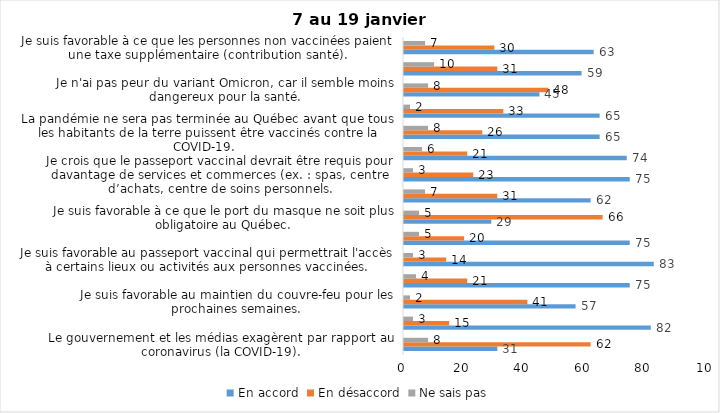
| Category | En accord | En désaccord | Ne sais pas |
|---|---|---|---|
| Le gouvernement et les médias exagèrent par rapport au coronavirus (la COVID-19). | 31 | 62 | 8 |
| J’ai peur que le système de santé soit débordé par les cas de COVID-19. | 82 | 15 | 3 |
| Je suis favorable au maintien du couvre-feu pour les prochaines semaines. | 57 | 41 | 2 |
| Je suis inquiet/inquiète que le nombre de cas augmente en raison des nouveaux variants du virus de la COVID-19. | 75 | 21 | 4 |
| Je suis favorable au passeport vaccinal qui permettrait l'accès à certains lieux ou activités aux personnes vaccinées. | 83 | 14 | 3 |
| Je suis confiant que la vaccination protège efficacement contre les variants de la COVID-19 | 75 | 20 | 5 |
| Je suis favorable à ce que le port du masque ne soit plus obligatoire au Québec. | 29 | 66 | 5 |
| J'ai peur que la reprise des cours en présentiel dans les écoles primaires et secondaires génère une augmentation des cas de COVID-19 | 62 | 31 | 7 |
| Je crois que le passeport vaccinal devrait être requis pour davantage de services et commerces (ex. : spas, centre d’achats, centre de soins personnels. | 75 | 23 | 3 |
| Les personnes non adéquatement vaccinées contre la COVID-19 sont responsables des nouveaux cas et hospitalisations et contribuent à la prolongation de la pandémie au Québec. | 74 | 21 | 6 |
| La pandémie ne sera pas terminée au Québec avant que tous les habitants de la terre puissent être vaccinés contre la COVID-19.   | 65 | 26 | 8 |
| Je suis inconfortable d’être en contact avec une personne non vaccinée contre la COVID-19 | 65 | 33 | 2 |
| Je n'ai pas peur du variant Omicron, car il semble moins dangereux pour la santé. | 45 | 48 | 8 |
| La vaccination obligatoire contre la COVID-19 mettrait fin à la pandémie. | 59 | 31 | 10 |
| Je suis favorable à ce que les personnes non vaccinées paient une taxe supplémentaire (contribution santé). | 63 | 30 | 7 |